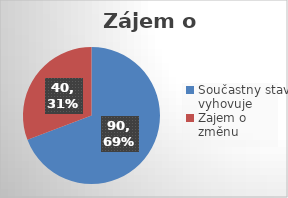
| Category | Series 0 |
|---|---|
| Součastny stav vyhovuje | 90 |
| Zajem o změnu | 40 |